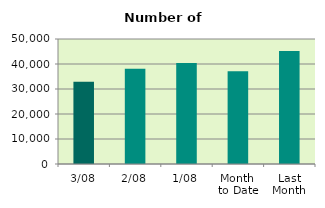
| Category | Series 0 |
|---|---|
| 3/08 | 32860 |
| 2/08 | 38138 |
| 1/08 | 40362 |
| Month 
to Date | 37120 |
| Last
Month | 45220.286 |